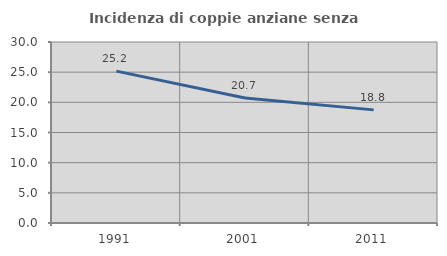
| Category | Incidenza di coppie anziane senza figli  |
|---|---|
| 1991.0 | 25.17 |
| 2001.0 | 20.714 |
| 2011.0 | 18.75 |